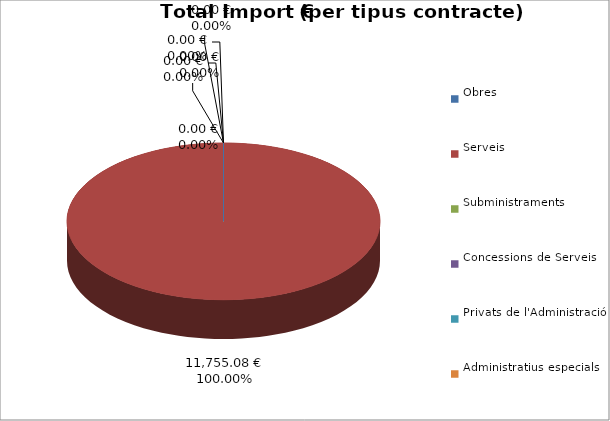
| Category | Total preu
(amb IVA) |
|---|---|
| Obres | 0 |
| Serveis | 11755.08 |
| Subministraments | 0 |
| Concessions de Serveis | 0 |
| Privats de l'Administració | 0 |
| Administratius especials | 0 |